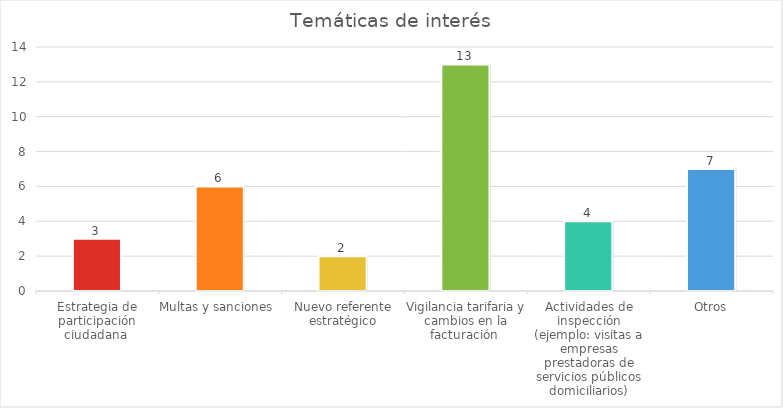
| Category | Series 0 |
|---|---|
| Estrategia de participación ciudadana  | 3 |
| Multas y sanciones  | 6 |
| Nuevo referente estratégico | 2 |
| Vigilancia tarifaria y cambios en la facturación  | 13 |
| Actividades de inspección (ejemplo: visitas a empresas prestadoras de servicios públicos domiciliarios) | 4 |
| Otros | 7 |